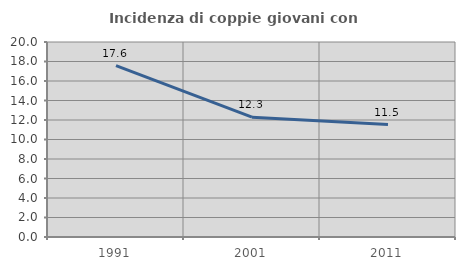
| Category | Incidenza di coppie giovani con figli |
|---|---|
| 1991.0 | 17.585 |
| 2001.0 | 12.289 |
| 2011.0 | 11.531 |